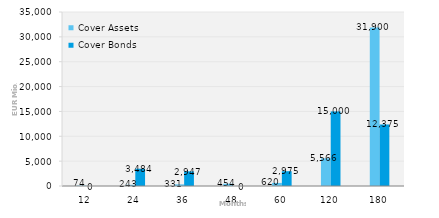
| Category | Cover Assets | Cover Bonds |
|---|---|---|
| 12.0 | 74.165 | 0 |
| 24.0 | 242.555 | 3484 |
| 36.0 | 330.597 | 2947 |
| 48.0 | 454.047 | 0 |
| 60.0 | 620.173 | 2975 |
| 120.0 | 5566.27 | 15000 |
| 180.0 | 31899.983 | 12375 |